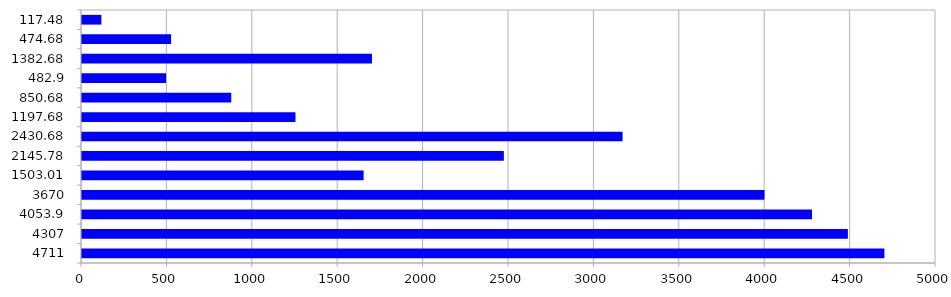
| Category | Series 0 |
|---|---|
| 4711 | 4698 |
| 4307 | 4484 |
| 4053,9 | 4273.9 |
| 3670 | 3995.89 |
| 1503,01 | 1648.89 |
| 2145,78 | 2469.9 |
| 2430,68 | 3164.9 |
| 1197,68 | 1249.9 |
| 850,68 | 873.9 |
| 482,9 | 492 |
| 1382,68 | 1697.7 |
| 474,68 | 521.7 |
| 117,48 | 113.6 |